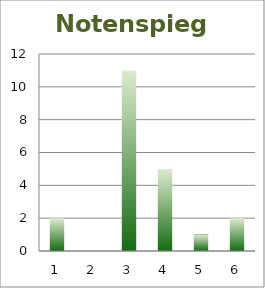
| Category | Series 0 |
|---|---|
| 0 | 2 |
| 1 | 0 |
| 2 | 11 |
| 3 | 5 |
| 4 | 1 |
| 5 | 2 |